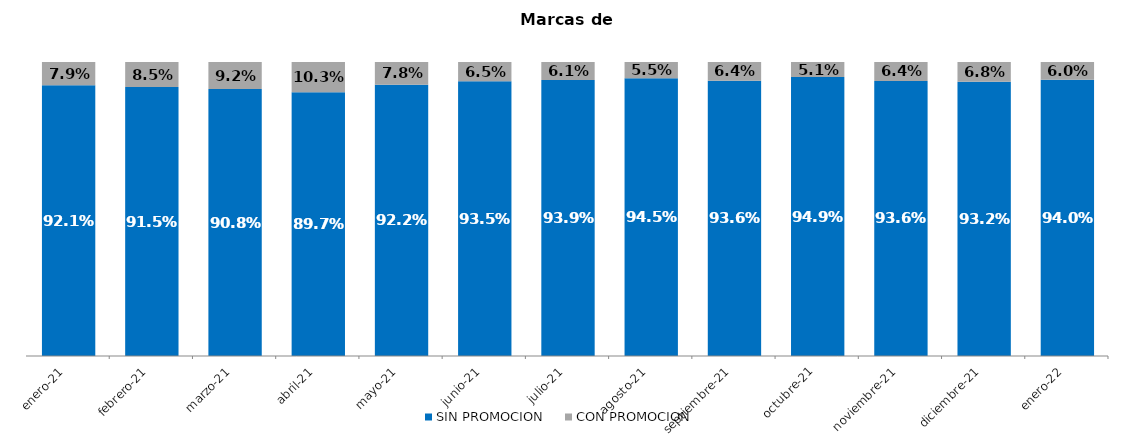
| Category | SIN PROMOCION   | CON PROMOCION   |
|---|---|---|
| 2021-01-01 | 0.921 | 0.079 |
| 2021-02-01 | 0.915 | 0.085 |
| 2021-03-01 | 0.908 | 0.092 |
| 2021-04-01 | 0.897 | 0.103 |
| 2021-05-01 | 0.922 | 0.078 |
| 2021-06-01 | 0.935 | 0.065 |
| 2021-07-01 | 0.939 | 0.061 |
| 2021-08-01 | 0.945 | 0.055 |
| 2021-09-01 | 0.936 | 0.064 |
| 2021-10-01 | 0.949 | 0.051 |
| 2021-11-01 | 0.936 | 0.064 |
| 2021-12-01 | 0.932 | 0.068 |
| 2022-01-01 | 0.94 | 0.06 |